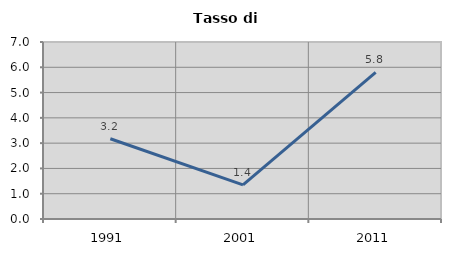
| Category | Tasso di disoccupazione   |
|---|---|
| 1991.0 | 3.175 |
| 2001.0 | 1.351 |
| 2011.0 | 5.797 |